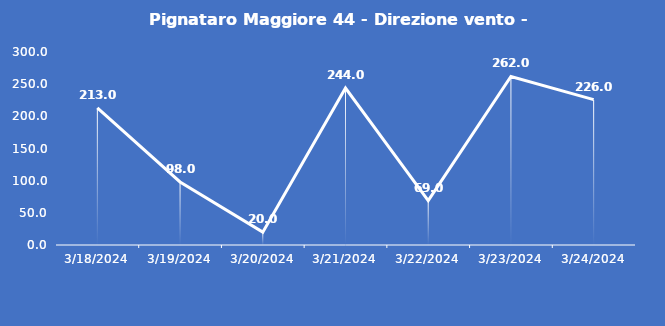
| Category | Pignataro Maggiore 44 - Direzione vento - Grezzo (°N) |
|---|---|
| 3/18/24 | 213 |
| 3/19/24 | 98 |
| 3/20/24 | 20 |
| 3/21/24 | 244 |
| 3/22/24 | 69 |
| 3/23/24 | 262 |
| 3/24/24 | 226 |